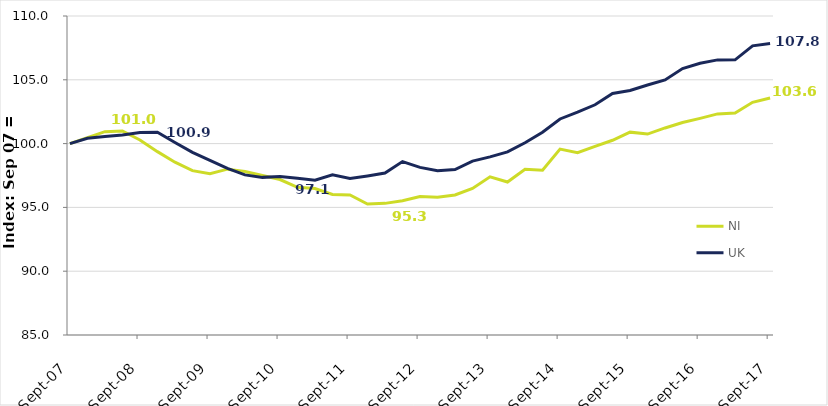
| Category | NI | UK |
|---|---|---|
| 2007-09-01 | 100 | 100 |
| 2007-12-01 | 100.471 | 100.413 |
| 2008-03-01 | 100.935 | 100.551 |
| 2008-06-01 | 100.994 | 100.672 |
| 2008-09-01 | 100.285 | 100.875 |
| 2008-12-01 | 99.37 | 100.896 |
| 2009-03-01 | 98.543 | 100.085 |
| 2009-06-01 | 97.881 | 99.313 |
| 2009-09-01 | 97.632 | 98.677 |
| 2009-12-01 | 97.997 | 98.051 |
| 2010-03-01 | 97.807 | 97.549 |
| 2010-06-01 | 97.494 | 97.353 |
| 2010-09-01 | 97.184 | 97.421 |
| 2010-12-01 | 96.575 | 97.286 |
| 2011-03-01 | 96.473 | 97.133 |
| 2011-06-01 | 96.015 | 97.556 |
| 2011-09-01 | 95.97 | 97.265 |
| 2011-12-01 | 95.269 | 97.464 |
| 2012-03-01 | 95.316 | 97.688 |
| 2012-06-01 | 95.517 | 98.591 |
| 2012-09-01 | 95.845 | 98.136 |
| 2012-12-01 | 95.797 | 97.876 |
| 2013-03-01 | 95.972 | 97.965 |
| 2013-06-01 | 96.49 | 98.623 |
| 2013-09-01 | 97.398 | 98.961 |
| 2013-12-01 | 96.992 | 99.349 |
| 2014-03-01 | 97.987 | 100.068 |
| 2014-06-01 | 97.915 | 100.889 |
| 2014-09-01 | 99.567 | 101.932 |
| 2014-12-01 | 99.284 | 102.465 |
| 2015-03-01 | 99.786 | 103.041 |
| 2015-06-01 | 100.263 | 103.931 |
| 2015-09-01 | 100.898 | 104.162 |
| 2015-12-01 | 100.746 | 104.592 |
| 2016-03-01 | 101.226 | 104.987 |
| 2016-06-01 | 101.648 | 105.884 |
| 2016-09-01 | 101.974 | 106.3 |
| 2016-12-01 | 102.326 | 106.559 |
| 2017-03-01 | 102.402 | 106.567 |
| 2017-06-01 | 103.233 | 107.662 |
| 2017-09-01 | 103.572 | 107.847 |